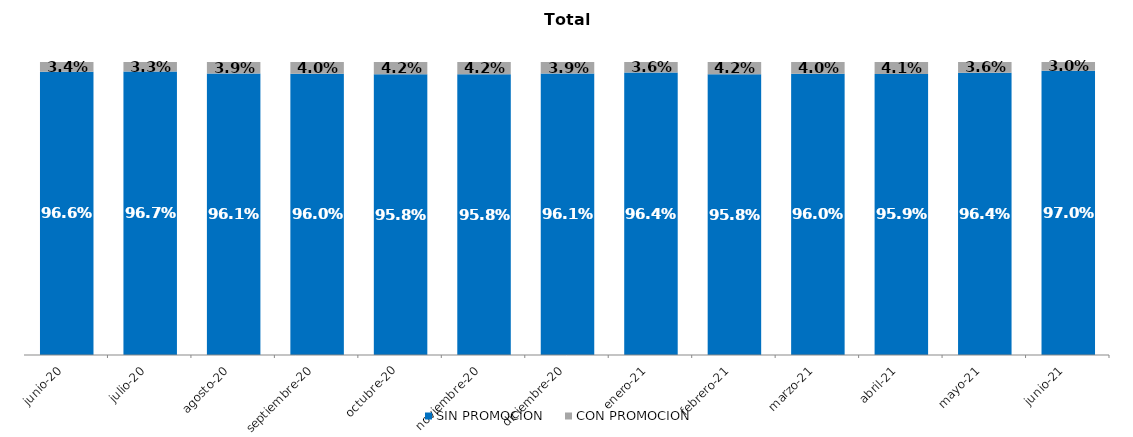
| Category | SIN PROMOCION   | CON PROMOCION   |
|---|---|---|
| 2020-06-01 | 0.966 | 0.034 |
| 2020-07-01 | 0.967 | 0.033 |
| 2020-08-01 | 0.961 | 0.039 |
| 2020-09-01 | 0.96 | 0.04 |
| 2020-10-01 | 0.958 | 0.042 |
| 2020-11-01 | 0.958 | 0.042 |
| 2020-12-01 | 0.961 | 0.039 |
| 2021-01-01 | 0.964 | 0.036 |
| 2021-02-01 | 0.958 | 0.042 |
| 2021-03-01 | 0.96 | 0.04 |
| 2021-04-01 | 0.959 | 0.041 |
| 2021-05-01 | 0.964 | 0.036 |
| 2021-06-01 | 0.97 | 0.03 |